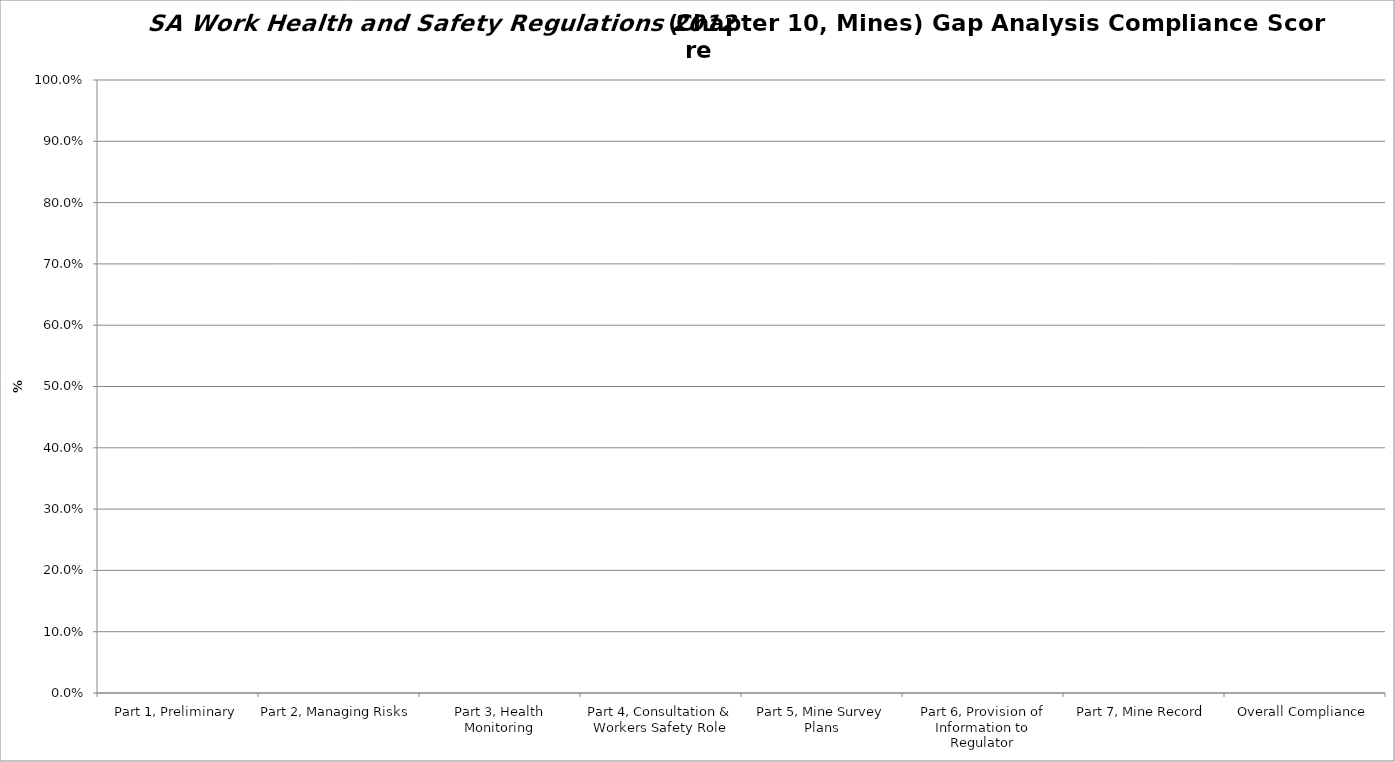
| Category | Series 0 |
|---|---|
| Part 1, Preliminary | 0 |
| Part 2, Managing Risks | 0 |
| Part 3, Health Monitoring | 0 |
| Part 4, Consultation & Workers Safety Role | 0 |
| Part 5, Mine Survey Plans | 0 |
| Part 6, Provision of Information to Regulator | 0 |
| Part 7, Mine Record | 0 |
| Overall Compliance | 0 |